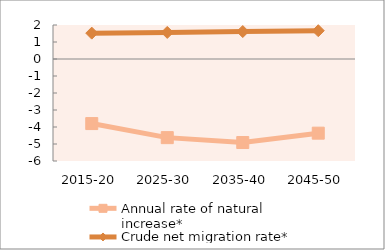
| Category | Annual rate of natural increase* | Crude net migration rate* |
|---|---|---|
| 2015-20 | -3.798 | 1.522 |
| 2025-30 | -4.625 | 1.563 |
| 2035-40 | -4.913 | 1.615 |
| 2045-50 | -4.363 | 1.664 |